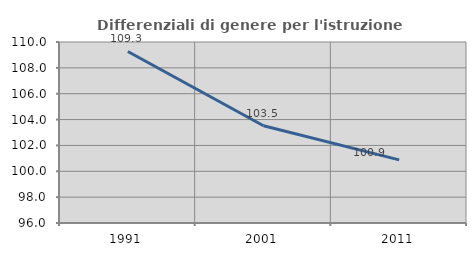
| Category | Differenziali di genere per l'istruzione superiore |
|---|---|
| 1991.0 | 109.266 |
| 2001.0 | 103.522 |
| 2011.0 | 100.883 |